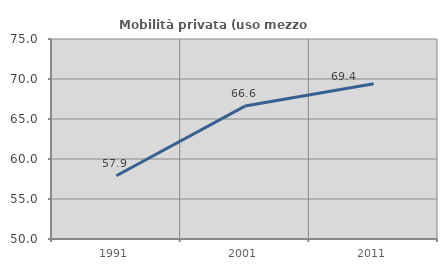
| Category | Mobilità privata (uso mezzo privato) |
|---|---|
| 1991.0 | 57.913 |
| 2001.0 | 66.616 |
| 2011.0 | 69.412 |